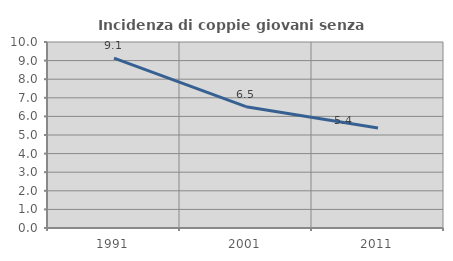
| Category | Incidenza di coppie giovani senza figli |
|---|---|
| 1991.0 | 9.131 |
| 2001.0 | 6.523 |
| 2011.0 | 5.379 |